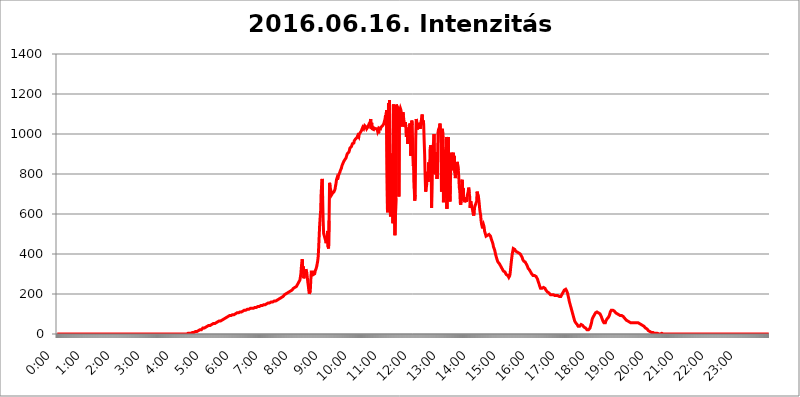
| Category | 2016.06.16. Intenzitás [W/m^2] |
|---|---|
| 0.0 | 0 |
| 0.0006944444444444445 | 0 |
| 0.001388888888888889 | 0 |
| 0.0020833333333333333 | 0 |
| 0.002777777777777778 | 0 |
| 0.003472222222222222 | 0 |
| 0.004166666666666667 | 0 |
| 0.004861111111111111 | 0 |
| 0.005555555555555556 | 0 |
| 0.0062499999999999995 | 0 |
| 0.006944444444444444 | 0 |
| 0.007638888888888889 | 0 |
| 0.008333333333333333 | 0 |
| 0.009027777777777779 | 0 |
| 0.009722222222222222 | 0 |
| 0.010416666666666666 | 0 |
| 0.011111111111111112 | 0 |
| 0.011805555555555555 | 0 |
| 0.012499999999999999 | 0 |
| 0.013194444444444444 | 0 |
| 0.013888888888888888 | 0 |
| 0.014583333333333332 | 0 |
| 0.015277777777777777 | 0 |
| 0.015972222222222224 | 0 |
| 0.016666666666666666 | 0 |
| 0.017361111111111112 | 0 |
| 0.018055555555555557 | 0 |
| 0.01875 | 0 |
| 0.019444444444444445 | 0 |
| 0.02013888888888889 | 0 |
| 0.020833333333333332 | 0 |
| 0.02152777777777778 | 0 |
| 0.022222222222222223 | 0 |
| 0.02291666666666667 | 0 |
| 0.02361111111111111 | 0 |
| 0.024305555555555556 | 0 |
| 0.024999999999999998 | 0 |
| 0.025694444444444447 | 0 |
| 0.02638888888888889 | 0 |
| 0.027083333333333334 | 0 |
| 0.027777777777777776 | 0 |
| 0.02847222222222222 | 0 |
| 0.029166666666666664 | 0 |
| 0.029861111111111113 | 0 |
| 0.030555555555555555 | 0 |
| 0.03125 | 0 |
| 0.03194444444444445 | 0 |
| 0.03263888888888889 | 0 |
| 0.03333333333333333 | 0 |
| 0.034027777777777775 | 0 |
| 0.034722222222222224 | 0 |
| 0.035416666666666666 | 0 |
| 0.036111111111111115 | 0 |
| 0.03680555555555556 | 0 |
| 0.0375 | 0 |
| 0.03819444444444444 | 0 |
| 0.03888888888888889 | 0 |
| 0.03958333333333333 | 0 |
| 0.04027777777777778 | 0 |
| 0.04097222222222222 | 0 |
| 0.041666666666666664 | 0 |
| 0.042361111111111106 | 0 |
| 0.04305555555555556 | 0 |
| 0.043750000000000004 | 0 |
| 0.044444444444444446 | 0 |
| 0.04513888888888889 | 0 |
| 0.04583333333333334 | 0 |
| 0.04652777777777778 | 0 |
| 0.04722222222222222 | 0 |
| 0.04791666666666666 | 0 |
| 0.04861111111111111 | 0 |
| 0.049305555555555554 | 0 |
| 0.049999999999999996 | 0 |
| 0.05069444444444445 | 0 |
| 0.051388888888888894 | 0 |
| 0.052083333333333336 | 0 |
| 0.05277777777777778 | 0 |
| 0.05347222222222222 | 0 |
| 0.05416666666666667 | 0 |
| 0.05486111111111111 | 0 |
| 0.05555555555555555 | 0 |
| 0.05625 | 0 |
| 0.05694444444444444 | 0 |
| 0.057638888888888885 | 0 |
| 0.05833333333333333 | 0 |
| 0.05902777777777778 | 0 |
| 0.059722222222222225 | 0 |
| 0.06041666666666667 | 0 |
| 0.061111111111111116 | 0 |
| 0.06180555555555556 | 0 |
| 0.0625 | 0 |
| 0.06319444444444444 | 0 |
| 0.06388888888888888 | 0 |
| 0.06458333333333334 | 0 |
| 0.06527777777777778 | 0 |
| 0.06597222222222222 | 0 |
| 0.06666666666666667 | 0 |
| 0.06736111111111111 | 0 |
| 0.06805555555555555 | 0 |
| 0.06874999999999999 | 0 |
| 0.06944444444444443 | 0 |
| 0.07013888888888889 | 0 |
| 0.07083333333333333 | 0 |
| 0.07152777777777779 | 0 |
| 0.07222222222222223 | 0 |
| 0.07291666666666667 | 0 |
| 0.07361111111111111 | 0 |
| 0.07430555555555556 | 0 |
| 0.075 | 0 |
| 0.07569444444444444 | 0 |
| 0.0763888888888889 | 0 |
| 0.07708333333333334 | 0 |
| 0.07777777777777778 | 0 |
| 0.07847222222222222 | 0 |
| 0.07916666666666666 | 0 |
| 0.0798611111111111 | 0 |
| 0.08055555555555556 | 0 |
| 0.08125 | 0 |
| 0.08194444444444444 | 0 |
| 0.08263888888888889 | 0 |
| 0.08333333333333333 | 0 |
| 0.08402777777777777 | 0 |
| 0.08472222222222221 | 0 |
| 0.08541666666666665 | 0 |
| 0.08611111111111112 | 0 |
| 0.08680555555555557 | 0 |
| 0.08750000000000001 | 0 |
| 0.08819444444444445 | 0 |
| 0.08888888888888889 | 0 |
| 0.08958333333333333 | 0 |
| 0.09027777777777778 | 0 |
| 0.09097222222222222 | 0 |
| 0.09166666666666667 | 0 |
| 0.09236111111111112 | 0 |
| 0.09305555555555556 | 0 |
| 0.09375 | 0 |
| 0.09444444444444444 | 0 |
| 0.09513888888888888 | 0 |
| 0.09583333333333333 | 0 |
| 0.09652777777777777 | 0 |
| 0.09722222222222222 | 0 |
| 0.09791666666666667 | 0 |
| 0.09861111111111111 | 0 |
| 0.09930555555555555 | 0 |
| 0.09999999999999999 | 0 |
| 0.10069444444444443 | 0 |
| 0.1013888888888889 | 0 |
| 0.10208333333333335 | 0 |
| 0.10277777777777779 | 0 |
| 0.10347222222222223 | 0 |
| 0.10416666666666667 | 0 |
| 0.10486111111111111 | 0 |
| 0.10555555555555556 | 0 |
| 0.10625 | 0 |
| 0.10694444444444444 | 0 |
| 0.1076388888888889 | 0 |
| 0.10833333333333334 | 0 |
| 0.10902777777777778 | 0 |
| 0.10972222222222222 | 0 |
| 0.1111111111111111 | 0 |
| 0.11180555555555556 | 0 |
| 0.11180555555555556 | 0 |
| 0.1125 | 0 |
| 0.11319444444444444 | 0 |
| 0.11388888888888889 | 0 |
| 0.11458333333333333 | 0 |
| 0.11527777777777777 | 0 |
| 0.11597222222222221 | 0 |
| 0.11666666666666665 | 0 |
| 0.1173611111111111 | 0 |
| 0.11805555555555557 | 0 |
| 0.11944444444444445 | 0 |
| 0.12013888888888889 | 0 |
| 0.12083333333333333 | 0 |
| 0.12152777777777778 | 0 |
| 0.12222222222222223 | 0 |
| 0.12291666666666667 | 0 |
| 0.12291666666666667 | 0 |
| 0.12361111111111112 | 0 |
| 0.12430555555555556 | 0 |
| 0.125 | 0 |
| 0.12569444444444444 | 0 |
| 0.12638888888888888 | 0 |
| 0.12708333333333333 | 0 |
| 0.16875 | 0 |
| 0.12847222222222224 | 0 |
| 0.12916666666666668 | 0 |
| 0.12986111111111112 | 0 |
| 0.13055555555555556 | 0 |
| 0.13125 | 0 |
| 0.13194444444444445 | 0 |
| 0.1326388888888889 | 0 |
| 0.13333333333333333 | 0 |
| 0.13402777777777777 | 0 |
| 0.13402777777777777 | 0 |
| 0.13472222222222222 | 0 |
| 0.13541666666666666 | 0 |
| 0.1361111111111111 | 0 |
| 0.13749999999999998 | 0 |
| 0.13819444444444443 | 0 |
| 0.1388888888888889 | 0 |
| 0.13958333333333334 | 0 |
| 0.14027777777777778 | 0 |
| 0.14097222222222222 | 0 |
| 0.14166666666666666 | 0 |
| 0.1423611111111111 | 0 |
| 0.14305555555555557 | 0 |
| 0.14375000000000002 | 0 |
| 0.14444444444444446 | 0 |
| 0.1451388888888889 | 0 |
| 0.1451388888888889 | 0 |
| 0.14652777777777778 | 0 |
| 0.14722222222222223 | 0 |
| 0.14791666666666667 | 0 |
| 0.1486111111111111 | 0 |
| 0.14930555555555555 | 0 |
| 0.15 | 0 |
| 0.15069444444444444 | 0 |
| 0.15138888888888888 | 0 |
| 0.15208333333333332 | 0 |
| 0.15277777777777776 | 0 |
| 0.15347222222222223 | 0 |
| 0.15416666666666667 | 0 |
| 0.15486111111111112 | 0 |
| 0.15555555555555556 | 0 |
| 0.15625 | 0 |
| 0.15694444444444444 | 0 |
| 0.15763888888888888 | 0 |
| 0.15833333333333333 | 0 |
| 0.15902777777777777 | 0 |
| 0.15972222222222224 | 0 |
| 0.16041666666666668 | 0 |
| 0.16111111111111112 | 0 |
| 0.16180555555555556 | 0 |
| 0.1625 | 0 |
| 0.16319444444444445 | 0 |
| 0.1638888888888889 | 0 |
| 0.16458333333333333 | 0 |
| 0.16527777777777777 | 0 |
| 0.16597222222222222 | 0 |
| 0.16666666666666666 | 0 |
| 0.1673611111111111 | 0 |
| 0.16805555555555554 | 0 |
| 0.16874999999999998 | 0 |
| 0.16944444444444443 | 0 |
| 0.17013888888888887 | 0 |
| 0.1708333333333333 | 0 |
| 0.17152777777777775 | 0 |
| 0.17222222222222225 | 0 |
| 0.1729166666666667 | 0 |
| 0.17361111111111113 | 0 |
| 0.17430555555555557 | 0 |
| 0.17500000000000002 | 0 |
| 0.17569444444444446 | 0 |
| 0.1763888888888889 | 0 |
| 0.17708333333333334 | 0 |
| 0.17777777777777778 | 0 |
| 0.17847222222222223 | 0 |
| 0.17916666666666667 | 0 |
| 0.1798611111111111 | 0 |
| 0.18055555555555555 | 0 |
| 0.18125 | 0 |
| 0.18194444444444444 | 0 |
| 0.1826388888888889 | 0 |
| 0.18333333333333335 | 3.525 |
| 0.1840277777777778 | 3.525 |
| 0.18472222222222223 | 3.525 |
| 0.18541666666666667 | 3.525 |
| 0.18611111111111112 | 3.525 |
| 0.18680555555555556 | 3.525 |
| 0.1875 | 3.525 |
| 0.18819444444444444 | 3.525 |
| 0.18888888888888888 | 3.525 |
| 0.18958333333333333 | 7.887 |
| 0.19027777777777777 | 7.887 |
| 0.1909722222222222 | 7.887 |
| 0.19166666666666665 | 7.887 |
| 0.19236111111111112 | 7.887 |
| 0.19305555555555554 | 7.887 |
| 0.19375 | 12.257 |
| 0.19444444444444445 | 12.257 |
| 0.1951388888888889 | 12.257 |
| 0.19583333333333333 | 12.257 |
| 0.19652777777777777 | 12.257 |
| 0.19722222222222222 | 16.636 |
| 0.19791666666666666 | 16.636 |
| 0.1986111111111111 | 16.636 |
| 0.19930555555555554 | 16.636 |
| 0.19999999999999998 | 21.024 |
| 0.20069444444444443 | 21.024 |
| 0.20138888888888887 | 21.024 |
| 0.2020833333333333 | 21.024 |
| 0.2027777777777778 | 25.419 |
| 0.2034722222222222 | 25.419 |
| 0.2041666666666667 | 29.823 |
| 0.20486111111111113 | 29.823 |
| 0.20555555555555557 | 29.823 |
| 0.20625000000000002 | 29.823 |
| 0.20694444444444446 | 29.823 |
| 0.2076388888888889 | 34.234 |
| 0.20833333333333334 | 34.234 |
| 0.20902777777777778 | 38.653 |
| 0.20972222222222223 | 38.653 |
| 0.21041666666666667 | 38.653 |
| 0.2111111111111111 | 38.653 |
| 0.21180555555555555 | 38.653 |
| 0.2125 | 43.079 |
| 0.21319444444444444 | 43.079 |
| 0.2138888888888889 | 43.079 |
| 0.21458333333333335 | 43.079 |
| 0.2152777777777778 | 47.511 |
| 0.21597222222222223 | 47.511 |
| 0.21666666666666667 | 47.511 |
| 0.21736111111111112 | 47.511 |
| 0.21805555555555556 | 47.511 |
| 0.21875 | 51.951 |
| 0.21944444444444444 | 51.951 |
| 0.22013888888888888 | 51.951 |
| 0.22083333333333333 | 51.951 |
| 0.22152777777777777 | 56.398 |
| 0.2222222222222222 | 56.398 |
| 0.22291666666666665 | 56.398 |
| 0.2236111111111111 | 56.398 |
| 0.22430555555555556 | 60.85 |
| 0.225 | 60.85 |
| 0.22569444444444445 | 60.85 |
| 0.2263888888888889 | 60.85 |
| 0.22708333333333333 | 65.31 |
| 0.22777777777777777 | 65.31 |
| 0.22847222222222222 | 65.31 |
| 0.22916666666666666 | 65.31 |
| 0.2298611111111111 | 69.775 |
| 0.23055555555555554 | 69.775 |
| 0.23124999999999998 | 69.775 |
| 0.23194444444444443 | 74.246 |
| 0.23263888888888887 | 74.246 |
| 0.2333333333333333 | 74.246 |
| 0.2340277777777778 | 78.722 |
| 0.2347222222222222 | 78.722 |
| 0.2354166666666667 | 78.722 |
| 0.23611111111111113 | 78.722 |
| 0.23680555555555557 | 83.205 |
| 0.23750000000000002 | 83.205 |
| 0.23819444444444446 | 83.205 |
| 0.2388888888888889 | 83.205 |
| 0.23958333333333334 | 87.692 |
| 0.24027777777777778 | 87.692 |
| 0.24097222222222223 | 87.692 |
| 0.24166666666666667 | 92.184 |
| 0.2423611111111111 | 92.184 |
| 0.24305555555555555 | 92.184 |
| 0.24375 | 92.184 |
| 0.24444444444444446 | 92.184 |
| 0.24513888888888888 | 92.184 |
| 0.24583333333333335 | 96.682 |
| 0.2465277777777778 | 96.682 |
| 0.24722222222222223 | 96.682 |
| 0.24791666666666667 | 96.682 |
| 0.24861111111111112 | 96.682 |
| 0.24930555555555556 | 101.184 |
| 0.25 | 101.184 |
| 0.25069444444444444 | 101.184 |
| 0.2513888888888889 | 101.184 |
| 0.2520833333333333 | 105.69 |
| 0.25277777777777777 | 105.69 |
| 0.2534722222222222 | 105.69 |
| 0.25416666666666665 | 105.69 |
| 0.2548611111111111 | 105.69 |
| 0.2555555555555556 | 110.201 |
| 0.25625000000000003 | 110.201 |
| 0.2569444444444445 | 110.201 |
| 0.2576388888888889 | 110.201 |
| 0.25833333333333336 | 110.201 |
| 0.2590277777777778 | 110.201 |
| 0.25972222222222224 | 114.716 |
| 0.2604166666666667 | 114.716 |
| 0.2611111111111111 | 114.716 |
| 0.26180555555555557 | 114.716 |
| 0.2625 | 119.235 |
| 0.26319444444444445 | 119.235 |
| 0.2638888888888889 | 119.235 |
| 0.26458333333333334 | 119.235 |
| 0.2652777777777778 | 119.235 |
| 0.2659722222222222 | 119.235 |
| 0.26666666666666666 | 123.758 |
| 0.2673611111111111 | 123.758 |
| 0.26805555555555555 | 123.758 |
| 0.26875 | 123.758 |
| 0.26944444444444443 | 123.758 |
| 0.2701388888888889 | 128.284 |
| 0.2708333333333333 | 128.284 |
| 0.27152777777777776 | 128.284 |
| 0.2722222222222222 | 128.284 |
| 0.27291666666666664 | 128.284 |
| 0.2736111111111111 | 128.284 |
| 0.2743055555555555 | 128.284 |
| 0.27499999999999997 | 128.284 |
| 0.27569444444444446 | 132.814 |
| 0.27638888888888885 | 132.814 |
| 0.27708333333333335 | 132.814 |
| 0.2777777777777778 | 132.814 |
| 0.27847222222222223 | 132.814 |
| 0.2791666666666667 | 132.814 |
| 0.2798611111111111 | 137.347 |
| 0.28055555555555556 | 137.347 |
| 0.28125 | 137.347 |
| 0.28194444444444444 | 137.347 |
| 0.2826388888888889 | 137.347 |
| 0.2833333333333333 | 137.347 |
| 0.28402777777777777 | 137.347 |
| 0.2847222222222222 | 141.884 |
| 0.28541666666666665 | 141.884 |
| 0.28611111111111115 | 141.884 |
| 0.28680555555555554 | 141.884 |
| 0.28750000000000003 | 141.884 |
| 0.2881944444444445 | 141.884 |
| 0.2888888888888889 | 146.423 |
| 0.28958333333333336 | 146.423 |
| 0.2902777777777778 | 146.423 |
| 0.29097222222222224 | 146.423 |
| 0.2916666666666667 | 146.423 |
| 0.2923611111111111 | 150.964 |
| 0.29305555555555557 | 150.964 |
| 0.29375 | 150.964 |
| 0.29444444444444445 | 155.509 |
| 0.2951388888888889 | 155.509 |
| 0.29583333333333334 | 155.509 |
| 0.2965277777777778 | 155.509 |
| 0.2972222222222222 | 155.509 |
| 0.29791666666666666 | 155.509 |
| 0.2986111111111111 | 155.509 |
| 0.29930555555555555 | 160.056 |
| 0.3 | 160.056 |
| 0.30069444444444443 | 155.509 |
| 0.3013888888888889 | 155.509 |
| 0.3020833333333333 | 160.056 |
| 0.30277777777777776 | 160.056 |
| 0.3034722222222222 | 160.056 |
| 0.30416666666666664 | 164.605 |
| 0.3048611111111111 | 164.605 |
| 0.3055555555555555 | 164.605 |
| 0.30624999999999997 | 164.605 |
| 0.3069444444444444 | 164.605 |
| 0.3076388888888889 | 164.605 |
| 0.30833333333333335 | 169.156 |
| 0.3090277777777778 | 169.156 |
| 0.30972222222222223 | 173.709 |
| 0.3104166666666667 | 173.709 |
| 0.3111111111111111 | 173.709 |
| 0.31180555555555556 | 173.709 |
| 0.3125 | 178.264 |
| 0.31319444444444444 | 178.264 |
| 0.3138888888888889 | 182.82 |
| 0.3145833333333333 | 182.82 |
| 0.31527777777777777 | 182.82 |
| 0.3159722222222222 | 187.378 |
| 0.31666666666666665 | 187.378 |
| 0.31736111111111115 | 191.937 |
| 0.31805555555555554 | 191.937 |
| 0.31875000000000003 | 196.497 |
| 0.3194444444444445 | 196.497 |
| 0.3201388888888889 | 201.058 |
| 0.32083333333333336 | 201.058 |
| 0.3215277777777778 | 201.058 |
| 0.32222222222222224 | 205.62 |
| 0.3229166666666667 | 205.62 |
| 0.3236111111111111 | 210.182 |
| 0.32430555555555557 | 210.182 |
| 0.325 | 210.182 |
| 0.32569444444444445 | 214.746 |
| 0.3263888888888889 | 214.746 |
| 0.32708333333333334 | 214.746 |
| 0.3277777777777778 | 219.309 |
| 0.3284722222222222 | 219.309 |
| 0.32916666666666666 | 219.309 |
| 0.3298611111111111 | 223.873 |
| 0.33055555555555555 | 223.873 |
| 0.33125 | 228.436 |
| 0.33194444444444443 | 228.436 |
| 0.3326388888888889 | 228.436 |
| 0.3333333333333333 | 233 |
| 0.3340277777777778 | 233 |
| 0.3347222222222222 | 237.564 |
| 0.3354166666666667 | 237.564 |
| 0.3361111111111111 | 242.127 |
| 0.3368055555555556 | 242.127 |
| 0.33749999999999997 | 251.251 |
| 0.33819444444444446 | 251.251 |
| 0.33888888888888885 | 260.373 |
| 0.33958333333333335 | 264.932 |
| 0.34027777777777773 | 269.49 |
| 0.34097222222222223 | 283.156 |
| 0.3416666666666666 | 301.354 |
| 0.3423611111111111 | 333.113 |
| 0.3430555555555555 | 360.221 |
| 0.34375 | 373.729 |
| 0.3444444444444445 | 301.354 |
| 0.3451388888888889 | 337.639 |
| 0.3458333333333334 | 278.603 |
| 0.34652777777777777 | 292.259 |
| 0.34722222222222227 | 292.259 |
| 0.34791666666666665 | 310.44 |
| 0.34861111111111115 | 324.052 |
| 0.34930555555555554 | 324.052 |
| 0.35000000000000003 | 305.898 |
| 0.3506944444444444 | 283.156 |
| 0.3513888888888889 | 260.373 |
| 0.3520833333333333 | 242.127 |
| 0.3527777777777778 | 219.309 |
| 0.3534722222222222 | 201.058 |
| 0.3541666666666667 | 201.058 |
| 0.3548611111111111 | 214.746 |
| 0.35555555555555557 | 264.932 |
| 0.35625 | 310.44 |
| 0.35694444444444445 | 314.98 |
| 0.3576388888888889 | 314.98 |
| 0.35833333333333334 | 310.44 |
| 0.3590277777777778 | 296.808 |
| 0.3597222222222222 | 296.808 |
| 0.36041666666666666 | 301.354 |
| 0.3611111111111111 | 301.354 |
| 0.36180555555555555 | 314.98 |
| 0.3625 | 319.517 |
| 0.36319444444444443 | 328.584 |
| 0.3638888888888889 | 337.639 |
| 0.3645833333333333 | 351.198 |
| 0.3652777777777778 | 364.728 |
| 0.3659722222222222 | 387.202 |
| 0.3666666666666667 | 431.833 |
| 0.3673611111111111 | 489.108 |
| 0.3680555555555556 | 545.416 |
| 0.36874999999999997 | 583.779 |
| 0.36944444444444446 | 617.436 |
| 0.37013888888888885 | 703.762 |
| 0.37083333333333335 | 743.859 |
| 0.37152777777777773 | 775.492 |
| 0.37222222222222223 | 683.473 |
| 0.3729166666666666 | 571.049 |
| 0.3736111111111111 | 502.192 |
| 0.3743055555555555 | 493.475 |
| 0.375 | 489.108 |
| 0.3756944444444445 | 489.108 |
| 0.3763888888888889 | 467.187 |
| 0.3770833333333334 | 453.968 |
| 0.37777777777777777 | 467.187 |
| 0.37847222222222227 | 467.187 |
| 0.37916666666666665 | 515.223 |
| 0.37986111111111115 | 436.27 |
| 0.38055555555555554 | 427.39 |
| 0.38125000000000003 | 566.793 |
| 0.3819444444444444 | 755.766 |
| 0.3826388888888889 | 735.89 |
| 0.3833333333333333 | 723.889 |
| 0.3840277777777778 | 711.832 |
| 0.3847222222222222 | 695.666 |
| 0.3854166666666667 | 699.717 |
| 0.3861111111111111 | 703.762 |
| 0.38680555555555557 | 703.762 |
| 0.3875 | 707.8 |
| 0.38819444444444445 | 711.832 |
| 0.3888888888888889 | 715.858 |
| 0.38958333333333334 | 723.889 |
| 0.3902777777777778 | 739.877 |
| 0.3909722222222222 | 751.803 |
| 0.39166666666666666 | 771.559 |
| 0.3923611111111111 | 779.42 |
| 0.39305555555555555 | 771.559 |
| 0.39375 | 783.342 |
| 0.39444444444444443 | 783.342 |
| 0.3951388888888889 | 798.974 |
| 0.3958333333333333 | 798.974 |
| 0.3965277777777778 | 810.641 |
| 0.3972222222222222 | 818.392 |
| 0.3979166666666667 | 822.26 |
| 0.3986111111111111 | 829.981 |
| 0.3993055555555556 | 841.526 |
| 0.39999999999999997 | 845.365 |
| 0.40069444444444446 | 853.029 |
| 0.40138888888888885 | 856.855 |
| 0.40208333333333335 | 864.493 |
| 0.40277777777777773 | 868.305 |
| 0.40347222222222223 | 872.114 |
| 0.4041666666666666 | 875.918 |
| 0.4048611111111111 | 879.719 |
| 0.4055555555555555 | 887.309 |
| 0.40625 | 894.885 |
| 0.4069444444444445 | 902.447 |
| 0.4076388888888889 | 906.223 |
| 0.4083333333333334 | 902.447 |
| 0.40902777777777777 | 909.996 |
| 0.40972222222222227 | 917.534 |
| 0.41041666666666665 | 928.819 |
| 0.41111111111111115 | 928.819 |
| 0.41180555555555554 | 932.576 |
| 0.41250000000000003 | 936.33 |
| 0.4131944444444444 | 943.832 |
| 0.4138888888888889 | 951.327 |
| 0.4145833333333333 | 955.071 |
| 0.4152777777777778 | 955.071 |
| 0.4159722222222222 | 955.071 |
| 0.4166666666666667 | 966.295 |
| 0.4173611111111111 | 970.034 |
| 0.41805555555555557 | 973.772 |
| 0.41875 | 973.772 |
| 0.41944444444444445 | 977.508 |
| 0.4201388888888889 | 981.244 |
| 0.42083333333333334 | 984.98 |
| 0.4215277777777778 | 992.448 |
| 0.4222222222222222 | 988.714 |
| 0.42291666666666666 | 984.98 |
| 0.4236111111111111 | 999.916 |
| 0.42430555555555555 | 999.916 |
| 0.425 | 1007.383 |
| 0.42569444444444443 | 1011.118 |
| 0.4263888888888889 | 1014.852 |
| 0.4270833333333333 | 1018.587 |
| 0.4277777777777778 | 1011.118 |
| 0.4284722222222222 | 1033.537 |
| 0.4291666666666667 | 1033.537 |
| 0.4298611111111111 | 1026.06 |
| 0.4305555555555556 | 1033.537 |
| 0.43124999999999997 | 1041.019 |
| 0.43194444444444446 | 1037.277 |
| 0.43263888888888885 | 1037.277 |
| 0.43333333333333335 | 1033.537 |
| 0.43402777777777773 | 1026.06 |
| 0.43472222222222223 | 1026.06 |
| 0.4354166666666666 | 1033.537 |
| 0.4361111111111111 | 1037.277 |
| 0.4368055555555555 | 1037.277 |
| 0.4375 | 1052.255 |
| 0.4381944444444445 | 1052.255 |
| 0.4388888888888889 | 1059.756 |
| 0.4395833333333334 | 1074.789 |
| 0.44027777777777777 | 1026.06 |
| 0.44097222222222227 | 1056.004 |
| 0.44166666666666665 | 1026.06 |
| 0.44236111111111115 | 1026.06 |
| 0.44305555555555554 | 1029.798 |
| 0.44375000000000003 | 1022.323 |
| 0.4444444444444444 | 1029.798 |
| 0.4451388888888889 | 1029.798 |
| 0.4458333333333333 | 1029.798 |
| 0.4465277777777778 | 1026.06 |
| 0.4472222222222222 | 1026.06 |
| 0.4479166666666667 | 1026.06 |
| 0.4486111111111111 | 1026.06 |
| 0.44930555555555557 | 1014.852 |
| 0.45 | 1022.323 |
| 0.45069444444444445 | 1003.65 |
| 0.4513888888888889 | 1029.798 |
| 0.45208333333333334 | 1026.06 |
| 0.4527777777777778 | 1026.06 |
| 0.4534722222222222 | 1026.06 |
| 0.45416666666666666 | 1033.537 |
| 0.4548611111111111 | 1029.798 |
| 0.45555555555555555 | 1037.277 |
| 0.45625 | 1041.019 |
| 0.45694444444444443 | 1044.762 |
| 0.4576388888888889 | 1048.508 |
| 0.4583333333333333 | 1056.004 |
| 0.4590277777777778 | 1059.756 |
| 0.4597222222222222 | 1074.789 |
| 0.4604166666666667 | 1093.653 |
| 0.4611111111111111 | 1071.027 |
| 0.4618055555555556 | 1120.238 |
| 0.46249999999999997 | 1124.056 |
| 0.46319444444444446 | 609.062 |
| 0.46388888888888885 | 837.682 |
| 0.46458333333333335 | 1154.814 |
| 0.46527777777777773 | 802.868 |
| 0.46597222222222223 | 1170.358 |
| 0.4666666666666666 | 707.8 |
| 0.4673611111111111 | 588.009 |
| 0.4680555555555555 | 763.674 |
| 0.46875 | 902.447 |
| 0.4694444444444445 | 759.723 |
| 0.4701388888888889 | 629.948 |
| 0.4708333333333334 | 553.986 |
| 0.47152777777777777 | 1147.086 |
| 0.47222222222222227 | 654.791 |
| 0.47291666666666665 | 658.909 |
| 0.47361111111111115 | 493.475 |
| 0.47430555555555554 | 497.836 |
| 0.47500000000000003 | 679.395 |
| 0.4756944444444444 | 1147.086 |
| 0.4763888888888889 | 1139.384 |
| 0.4770833333333333 | 1135.543 |
| 0.4777777777777778 | 1131.708 |
| 0.4784722222222222 | 1120.238 |
| 0.4791666666666667 | 687.544 |
| 0.4798611111111111 | 1108.816 |
| 0.48055555555555557 | 1105.019 |
| 0.48125 | 1127.879 |
| 0.48194444444444445 | 1120.238 |
| 0.4826388888888889 | 1105.019 |
| 0.48333333333333334 | 1074.789 |
| 0.4840277777777778 | 1037.277 |
| 0.4847222222222222 | 1108.816 |
| 0.48541666666666666 | 1093.653 |
| 0.4861111111111111 | 1071.027 |
| 0.48680555555555555 | 1071.027 |
| 0.4875 | 1037.277 |
| 0.48819444444444443 | 1059.756 |
| 0.4888888888888889 | 1037.277 |
| 0.4895833333333333 | 984.98 |
| 0.4902777777777778 | 988.714 |
| 0.4909722222222222 | 1003.65 |
| 0.4916666666666667 | 951.327 |
| 0.4923611111111111 | 1014.852 |
| 0.4930555555555556 | 1033.537 |
| 0.49374999999999997 | 1014.852 |
| 0.49444444444444446 | 1052.255 |
| 0.49513888888888885 | 1044.762 |
| 0.49583333333333335 | 891.099 |
| 0.49652777777777773 | 1014.852 |
| 0.49722222222222223 | 1067.267 |
| 0.4979166666666666 | 1044.762 |
| 0.4986111111111111 | 906.223 |
| 0.4993055555555555 | 841.526 |
| 0.5 | 853.029 |
| 0.5006944444444444 | 727.896 |
| 0.5013888888888889 | 667.123 |
| 0.5020833333333333 | 695.666 |
| 0.5027777777777778 | 973.772 |
| 0.5034722222222222 | 1074.789 |
| 0.5041666666666667 | 1063.51 |
| 0.5048611111111111 | 1022.323 |
| 0.5055555555555555 | 1037.277 |
| 0.50625 | 1056.004 |
| 0.5069444444444444 | 1037.277 |
| 0.5076388888888889 | 1052.255 |
| 0.5083333333333333 | 1033.537 |
| 0.5090277777777777 | 1026.06 |
| 0.5097222222222222 | 1022.323 |
| 0.5104166666666666 | 1022.323 |
| 0.5111111111111112 | 1078.555 |
| 0.5118055555555555 | 1097.437 |
| 0.5125000000000001 | 1048.508 |
| 0.5131944444444444 | 1067.267 |
| 0.513888888888889 | 1052.255 |
| 0.5145833333333333 | 970.034 |
| 0.5152777777777778 | 898.668 |
| 0.5159722222222222 | 791.169 |
| 0.5166666666666667 | 711.832 |
| 0.517361111111111 | 723.889 |
| 0.5180555555555556 | 743.859 |
| 0.5187499999999999 | 810.641 |
| 0.5194444444444445 | 791.169 |
| 0.5201388888888888 | 759.723 |
| 0.5208333333333334 | 856.855 |
| 0.5215277777777778 | 783.342 |
| 0.5222222222222223 | 802.868 |
| 0.5229166666666667 | 921.298 |
| 0.5236111111111111 | 943.832 |
| 0.5243055555555556 | 925.06 |
| 0.525 | 629.948 |
| 0.5256944444444445 | 798.974 |
| 0.5263888888888889 | 902.447 |
| 0.5270833333333333 | 932.576 |
| 0.5277777777777778 | 958.814 |
| 0.5284722222222222 | 999.916 |
| 0.5291666666666667 | 798.974 |
| 0.5298611111111111 | 806.757 |
| 0.5305555555555556 | 845.365 |
| 0.53125 | 872.114 |
| 0.5319444444444444 | 909.996 |
| 0.5326388888888889 | 775.492 |
| 0.5333333333333333 | 814.519 |
| 0.5340277777777778 | 1007.383 |
| 0.5347222222222222 | 1022.323 |
| 0.5354166666666667 | 1026.06 |
| 0.5361111111111111 | 1033.537 |
| 0.5368055555555555 | 1052.255 |
| 0.5375 | 1011.118 |
| 0.5381944444444444 | 951.327 |
| 0.5388888888888889 | 711.832 |
| 0.5395833333333333 | 1014.852 |
| 0.5402777777777777 | 1026.06 |
| 0.5409722222222222 | 981.244 |
| 0.5416666666666666 | 658.909 |
| 0.5423611111111112 | 822.26 |
| 0.5430555555555555 | 691.608 |
| 0.5437500000000001 | 679.395 |
| 0.5444444444444444 | 921.298 |
| 0.545138888888889 | 902.447 |
| 0.5458333333333333 | 984.98 |
| 0.5465277777777778 | 625.784 |
| 0.5472222222222222 | 940.082 |
| 0.5479166666666667 | 970.034 |
| 0.548611111111111 | 984.98 |
| 0.5493055555555556 | 679.395 |
| 0.5499999999999999 | 711.832 |
| 0.5506944444444445 | 663.019 |
| 0.5513888888888888 | 739.877 |
| 0.5520833333333334 | 906.223 |
| 0.5527777777777778 | 909.996 |
| 0.5534722222222223 | 872.114 |
| 0.5541666666666667 | 829.981 |
| 0.5548611111111111 | 818.392 |
| 0.5555555555555556 | 906.223 |
| 0.55625 | 875.918 |
| 0.5569444444444445 | 891.099 |
| 0.5576388888888889 | 806.757 |
| 0.5583333333333333 | 779.42 |
| 0.5590277777777778 | 818.392 |
| 0.5597222222222222 | 798.974 |
| 0.5604166666666667 | 822.26 |
| 0.5611111111111111 | 860.676 |
| 0.5618055555555556 | 864.493 |
| 0.5625 | 818.392 |
| 0.5631944444444444 | 783.342 |
| 0.5638888888888889 | 731.896 |
| 0.5645833333333333 | 715.858 |
| 0.5652777777777778 | 654.791 |
| 0.5659722222222222 | 646.537 |
| 0.5666666666666667 | 691.608 |
| 0.5673611111111111 | 763.674 |
| 0.5680555555555555 | 771.559 |
| 0.56875 | 715.858 |
| 0.5694444444444444 | 727.896 |
| 0.5701388888888889 | 667.123 |
| 0.5708333333333333 | 683.473 |
| 0.5715277777777777 | 658.909 |
| 0.5722222222222222 | 667.123 |
| 0.5729166666666666 | 671.22 |
| 0.5736111111111112 | 663.019 |
| 0.5743055555555555 | 667.123 |
| 0.5750000000000001 | 691.608 |
| 0.5756944444444444 | 691.608 |
| 0.576388888888889 | 711.832 |
| 0.5770833333333333 | 731.896 |
| 0.5777777777777778 | 703.762 |
| 0.5784722222222222 | 687.544 |
| 0.5791666666666667 | 629.948 |
| 0.579861111111111 | 663.019 |
| 0.5805555555555556 | 650.667 |
| 0.5812499999999999 | 642.4 |
| 0.5819444444444445 | 642.4 |
| 0.5826388888888888 | 617.436 |
| 0.5833333333333334 | 600.661 |
| 0.5840277777777778 | 592.233 |
| 0.5847222222222223 | 609.062 |
| 0.5854166666666667 | 634.105 |
| 0.5861111111111111 | 642.4 |
| 0.5868055555555556 | 642.4 |
| 0.5875 | 642.4 |
| 0.5881944444444445 | 663.019 |
| 0.5888888888888889 | 711.832 |
| 0.5895833333333333 | 707.8 |
| 0.5902777777777778 | 715.858 |
| 0.5909722222222222 | 679.395 |
| 0.5916666666666667 | 658.909 |
| 0.5923611111111111 | 629.948 |
| 0.5930555555555556 | 609.062 |
| 0.59375 | 596.45 |
| 0.5944444444444444 | 566.793 |
| 0.5951388888888889 | 549.704 |
| 0.5958333333333333 | 545.416 |
| 0.5965277777777778 | 528.2 |
| 0.5972222222222222 | 536.82 |
| 0.5979166666666667 | 545.416 |
| 0.5986111111111111 | 536.82 |
| 0.5993055555555555 | 515.223 |
| 0.6 | 515.223 |
| 0.6006944444444444 | 519.555 |
| 0.6013888888888889 | 489.108 |
| 0.6020833333333333 | 489.108 |
| 0.6027777777777777 | 489.108 |
| 0.6034722222222222 | 493.475 |
| 0.6041666666666666 | 489.108 |
| 0.6048611111111112 | 489.108 |
| 0.6055555555555555 | 497.836 |
| 0.6062500000000001 | 502.192 |
| 0.6069444444444444 | 497.836 |
| 0.607638888888889 | 489.108 |
| 0.6083333333333333 | 480.356 |
| 0.6090277777777778 | 471.582 |
| 0.6097222222222222 | 471.582 |
| 0.6104166666666667 | 458.38 |
| 0.611111111111111 | 449.551 |
| 0.6118055555555556 | 436.27 |
| 0.6124999999999999 | 431.833 |
| 0.6131944444444445 | 422.943 |
| 0.6138888888888888 | 414.035 |
| 0.6145833333333334 | 400.638 |
| 0.6152777777777778 | 391.685 |
| 0.6159722222222223 | 382.715 |
| 0.6166666666666667 | 373.729 |
| 0.6173611111111111 | 369.23 |
| 0.6180555555555556 | 360.221 |
| 0.61875 | 360.221 |
| 0.6194444444444445 | 355.712 |
| 0.6201388888888889 | 351.198 |
| 0.6208333333333333 | 346.682 |
| 0.6215277777777778 | 342.162 |
| 0.6222222222222222 | 337.639 |
| 0.6229166666666667 | 333.113 |
| 0.6236111111111111 | 328.584 |
| 0.6243055555555556 | 324.052 |
| 0.625 | 319.517 |
| 0.6256944444444444 | 314.98 |
| 0.6263888888888889 | 314.98 |
| 0.6270833333333333 | 314.98 |
| 0.6277777777777778 | 310.44 |
| 0.6284722222222222 | 305.898 |
| 0.6291666666666667 | 305.898 |
| 0.6298611111111111 | 296.808 |
| 0.6305555555555555 | 296.808 |
| 0.63125 | 292.259 |
| 0.6319444444444444 | 292.259 |
| 0.6326388888888889 | 287.709 |
| 0.6333333333333333 | 283.156 |
| 0.6340277777777777 | 287.709 |
| 0.6347222222222222 | 292.259 |
| 0.6354166666666666 | 310.44 |
| 0.6361111111111112 | 337.639 |
| 0.6368055555555555 | 360.221 |
| 0.6375000000000001 | 382.715 |
| 0.6381944444444444 | 400.638 |
| 0.638888888888889 | 414.035 |
| 0.6395833333333333 | 427.39 |
| 0.6402777777777778 | 427.39 |
| 0.6409722222222222 | 427.39 |
| 0.6416666666666667 | 422.943 |
| 0.642361111111111 | 418.492 |
| 0.6430555555555556 | 414.035 |
| 0.6437499999999999 | 409.574 |
| 0.6444444444444445 | 409.574 |
| 0.6451388888888888 | 409.574 |
| 0.6458333333333334 | 409.574 |
| 0.6465277777777778 | 409.574 |
| 0.6472222222222223 | 405.108 |
| 0.6479166666666667 | 405.108 |
| 0.6486111111111111 | 405.108 |
| 0.6493055555555556 | 400.638 |
| 0.65 | 396.164 |
| 0.6506944444444445 | 391.685 |
| 0.6513888888888889 | 387.202 |
| 0.6520833333333333 | 382.715 |
| 0.6527777777777778 | 373.729 |
| 0.6534722222222222 | 369.23 |
| 0.6541666666666667 | 364.728 |
| 0.6548611111111111 | 364.728 |
| 0.6555555555555556 | 364.728 |
| 0.65625 | 360.221 |
| 0.6569444444444444 | 355.712 |
| 0.6576388888888889 | 351.198 |
| 0.6583333333333333 | 346.682 |
| 0.6590277777777778 | 342.162 |
| 0.6597222222222222 | 337.639 |
| 0.6604166666666667 | 328.584 |
| 0.6611111111111111 | 324.052 |
| 0.6618055555555555 | 324.052 |
| 0.6625 | 319.517 |
| 0.6631944444444444 | 314.98 |
| 0.6638888888888889 | 310.44 |
| 0.6645833333333333 | 305.898 |
| 0.6652777777777777 | 301.354 |
| 0.6659722222222222 | 301.354 |
| 0.6666666666666666 | 296.808 |
| 0.6673611111111111 | 292.259 |
| 0.6680555555555556 | 292.259 |
| 0.6687500000000001 | 292.259 |
| 0.6694444444444444 | 292.259 |
| 0.6701388888888888 | 292.259 |
| 0.6708333333333334 | 292.259 |
| 0.6715277777777778 | 287.709 |
| 0.6722222222222222 | 283.156 |
| 0.6729166666666666 | 283.156 |
| 0.6736111111111112 | 274.047 |
| 0.6743055555555556 | 264.932 |
| 0.6749999999999999 | 260.373 |
| 0.6756944444444444 | 251.251 |
| 0.6763888888888889 | 242.127 |
| 0.6770833333333334 | 237.564 |
| 0.6777777777777777 | 228.436 |
| 0.6784722222222223 | 228.436 |
| 0.6791666666666667 | 228.436 |
| 0.6798611111111111 | 228.436 |
| 0.6805555555555555 | 223.873 |
| 0.68125 | 233 |
| 0.6819444444444445 | 233 |
| 0.6826388888888889 | 233 |
| 0.6833333333333332 | 233 |
| 0.6840277777777778 | 228.436 |
| 0.6847222222222222 | 223.873 |
| 0.6854166666666667 | 219.309 |
| 0.686111111111111 | 219.309 |
| 0.6868055555555556 | 219.309 |
| 0.6875 | 210.182 |
| 0.6881944444444444 | 210.182 |
| 0.688888888888889 | 205.62 |
| 0.6895833333333333 | 205.62 |
| 0.6902777777777778 | 201.058 |
| 0.6909722222222222 | 201.058 |
| 0.6916666666666668 | 196.497 |
| 0.6923611111111111 | 196.497 |
| 0.6930555555555555 | 196.497 |
| 0.69375 | 196.497 |
| 0.6944444444444445 | 191.937 |
| 0.6951388888888889 | 196.497 |
| 0.6958333333333333 | 196.497 |
| 0.6965277777777777 | 196.497 |
| 0.6972222222222223 | 196.497 |
| 0.6979166666666666 | 191.937 |
| 0.6986111111111111 | 191.937 |
| 0.6993055555555556 | 191.937 |
| 0.7000000000000001 | 191.937 |
| 0.7006944444444444 | 191.937 |
| 0.7013888888888888 | 191.937 |
| 0.7020833333333334 | 191.937 |
| 0.7027777777777778 | 187.378 |
| 0.7034722222222222 | 187.378 |
| 0.7041666666666666 | 187.378 |
| 0.7048611111111112 | 187.378 |
| 0.7055555555555556 | 187.378 |
| 0.7062499999999999 | 187.378 |
| 0.7069444444444444 | 191.937 |
| 0.7076388888888889 | 191.937 |
| 0.7083333333333334 | 201.058 |
| 0.7090277777777777 | 201.058 |
| 0.7097222222222223 | 210.182 |
| 0.7104166666666667 | 214.746 |
| 0.7111111111111111 | 219.309 |
| 0.7118055555555555 | 219.309 |
| 0.7125 | 223.873 |
| 0.7131944444444445 | 223.873 |
| 0.7138888888888889 | 219.309 |
| 0.7145833333333332 | 214.746 |
| 0.7152777777777778 | 210.182 |
| 0.7159722222222222 | 201.058 |
| 0.7166666666666667 | 187.378 |
| 0.717361111111111 | 178.264 |
| 0.7180555555555556 | 164.605 |
| 0.71875 | 155.509 |
| 0.7194444444444444 | 146.423 |
| 0.720138888888889 | 137.347 |
| 0.7208333333333333 | 128.284 |
| 0.7215277777777778 | 119.235 |
| 0.7222222222222222 | 110.201 |
| 0.7229166666666668 | 101.184 |
| 0.7236111111111111 | 92.184 |
| 0.7243055555555555 | 83.205 |
| 0.725 | 74.246 |
| 0.7256944444444445 | 65.31 |
| 0.7263888888888889 | 60.85 |
| 0.7270833333333333 | 56.398 |
| 0.7277777777777777 | 56.398 |
| 0.7284722222222223 | 51.951 |
| 0.7291666666666666 | 47.511 |
| 0.7298611111111111 | 43.079 |
| 0.7305555555555556 | 38.653 |
| 0.7312500000000001 | 38.653 |
| 0.7319444444444444 | 38.653 |
| 0.7326388888888888 | 38.653 |
| 0.7333333333333334 | 43.079 |
| 0.7340277777777778 | 43.079 |
| 0.7347222222222222 | 47.511 |
| 0.7354166666666666 | 47.511 |
| 0.7361111111111112 | 47.511 |
| 0.7368055555555556 | 43.079 |
| 0.7374999999999999 | 38.653 |
| 0.7381944444444444 | 38.653 |
| 0.7388888888888889 | 34.234 |
| 0.7395833333333334 | 29.823 |
| 0.7402777777777777 | 29.823 |
| 0.7409722222222223 | 29.823 |
| 0.7416666666666667 | 25.419 |
| 0.7423611111111111 | 25.419 |
| 0.7430555555555555 | 21.024 |
| 0.74375 | 21.024 |
| 0.7444444444444445 | 21.024 |
| 0.7451388888888889 | 21.024 |
| 0.7458333333333332 | 21.024 |
| 0.7465277777777778 | 25.419 |
| 0.7472222222222222 | 29.823 |
| 0.7479166666666667 | 38.653 |
| 0.748611111111111 | 47.511 |
| 0.7493055555555556 | 56.398 |
| 0.75 | 69.775 |
| 0.7506944444444444 | 78.722 |
| 0.751388888888889 | 83.205 |
| 0.7520833333333333 | 87.692 |
| 0.7527777777777778 | 92.184 |
| 0.7534722222222222 | 96.682 |
| 0.7541666666666668 | 101.184 |
| 0.7548611111111111 | 105.69 |
| 0.7555555555555555 | 105.69 |
| 0.75625 | 105.69 |
| 0.7569444444444445 | 110.201 |
| 0.7576388888888889 | 110.201 |
| 0.7583333333333333 | 110.201 |
| 0.7590277777777777 | 105.69 |
| 0.7597222222222223 | 105.69 |
| 0.7604166666666666 | 101.184 |
| 0.7611111111111111 | 101.184 |
| 0.7618055555555556 | 101.184 |
| 0.7625000000000001 | 92.184 |
| 0.7631944444444444 | 87.692 |
| 0.7638888888888888 | 78.722 |
| 0.7645833333333334 | 74.246 |
| 0.7652777777777778 | 65.31 |
| 0.7659722222222222 | 60.85 |
| 0.7666666666666666 | 56.398 |
| 0.7673611111111112 | 56.398 |
| 0.7680555555555556 | 56.398 |
| 0.7687499999999999 | 56.398 |
| 0.7694444444444444 | 65.31 |
| 0.7701388888888889 | 69.775 |
| 0.7708333333333334 | 74.246 |
| 0.7715277777777777 | 74.246 |
| 0.7722222222222223 | 78.722 |
| 0.7729166666666667 | 83.205 |
| 0.7736111111111111 | 87.692 |
| 0.7743055555555555 | 92.184 |
| 0.775 | 101.184 |
| 0.7756944444444445 | 110.201 |
| 0.7763888888888889 | 114.716 |
| 0.7770833333333332 | 119.235 |
| 0.7777777777777778 | 123.758 |
| 0.7784722222222222 | 123.758 |
| 0.7791666666666667 | 119.235 |
| 0.779861111111111 | 119.235 |
| 0.7805555555555556 | 114.716 |
| 0.78125 | 114.716 |
| 0.7819444444444444 | 110.201 |
| 0.782638888888889 | 110.201 |
| 0.7833333333333333 | 105.69 |
| 0.7840277777777778 | 105.69 |
| 0.7847222222222222 | 101.184 |
| 0.7854166666666668 | 101.184 |
| 0.7861111111111111 | 101.184 |
| 0.7868055555555555 | 96.682 |
| 0.7875 | 96.682 |
| 0.7881944444444445 | 96.682 |
| 0.7888888888888889 | 92.184 |
| 0.7895833333333333 | 92.184 |
| 0.7902777777777777 | 92.184 |
| 0.7909722222222223 | 92.184 |
| 0.7916666666666666 | 92.184 |
| 0.7923611111111111 | 92.184 |
| 0.7930555555555556 | 92.184 |
| 0.7937500000000001 | 87.692 |
| 0.7944444444444444 | 83.205 |
| 0.7951388888888888 | 83.205 |
| 0.7958333333333334 | 78.722 |
| 0.7965277777777778 | 78.722 |
| 0.7972222222222222 | 74.246 |
| 0.7979166666666666 | 69.775 |
| 0.7986111111111112 | 69.775 |
| 0.7993055555555556 | 65.31 |
| 0.7999999999999999 | 65.31 |
| 0.8006944444444444 | 65.31 |
| 0.8013888888888889 | 60.85 |
| 0.8020833333333334 | 60.85 |
| 0.8027777777777777 | 60.85 |
| 0.8034722222222223 | 56.398 |
| 0.8041666666666667 | 56.398 |
| 0.8048611111111111 | 56.398 |
| 0.8055555555555555 | 56.398 |
| 0.80625 | 56.398 |
| 0.8069444444444445 | 56.398 |
| 0.8076388888888889 | 56.398 |
| 0.8083333333333332 | 56.398 |
| 0.8090277777777778 | 56.398 |
| 0.8097222222222222 | 56.398 |
| 0.8104166666666667 | 56.398 |
| 0.811111111111111 | 56.398 |
| 0.8118055555555556 | 56.398 |
| 0.8125 | 56.398 |
| 0.8131944444444444 | 56.398 |
| 0.813888888888889 | 56.398 |
| 0.8145833333333333 | 56.398 |
| 0.8152777777777778 | 51.951 |
| 0.8159722222222222 | 51.951 |
| 0.8166666666666668 | 51.951 |
| 0.8173611111111111 | 51.951 |
| 0.8180555555555555 | 51.951 |
| 0.81875 | 47.511 |
| 0.8194444444444445 | 47.511 |
| 0.8201388888888889 | 47.511 |
| 0.8208333333333333 | 43.079 |
| 0.8215277777777777 | 43.079 |
| 0.8222222222222223 | 38.653 |
| 0.8229166666666666 | 38.653 |
| 0.8236111111111111 | 38.653 |
| 0.8243055555555556 | 34.234 |
| 0.8250000000000001 | 29.823 |
| 0.8256944444444444 | 29.823 |
| 0.8263888888888888 | 25.419 |
| 0.8270833333333334 | 25.419 |
| 0.8277777777777778 | 21.024 |
| 0.8284722222222222 | 21.024 |
| 0.8291666666666666 | 16.636 |
| 0.8298611111111112 | 16.636 |
| 0.8305555555555556 | 12.257 |
| 0.8312499999999999 | 12.257 |
| 0.8319444444444444 | 12.257 |
| 0.8326388888888889 | 12.257 |
| 0.8333333333333334 | 7.887 |
| 0.8340277777777777 | 7.887 |
| 0.8347222222222223 | 7.887 |
| 0.8354166666666667 | 7.887 |
| 0.8361111111111111 | 3.525 |
| 0.8368055555555555 | 3.525 |
| 0.8375 | 3.525 |
| 0.8381944444444445 | 3.525 |
| 0.8388888888888889 | 3.525 |
| 0.8395833333333332 | 3.525 |
| 0.8402777777777778 | 3.525 |
| 0.8409722222222222 | 3.525 |
| 0.8416666666666667 | 3.525 |
| 0.842361111111111 | 3.525 |
| 0.8430555555555556 | 3.525 |
| 0.84375 | 0 |
| 0.8444444444444444 | 0 |
| 0.845138888888889 | 0 |
| 0.8458333333333333 | 0 |
| 0.8465277777777778 | 0 |
| 0.8472222222222222 | 0 |
| 0.8479166666666668 | 3.525 |
| 0.8486111111111111 | 0 |
| 0.8493055555555555 | 0 |
| 0.85 | 0 |
| 0.8506944444444445 | 0 |
| 0.8513888888888889 | 0 |
| 0.8520833333333333 | 0 |
| 0.8527777777777777 | 0 |
| 0.8534722222222223 | 0 |
| 0.8541666666666666 | 0 |
| 0.8548611111111111 | 0 |
| 0.8555555555555556 | 0 |
| 0.8562500000000001 | 0 |
| 0.8569444444444444 | 0 |
| 0.8576388888888888 | 0 |
| 0.8583333333333334 | 0 |
| 0.8590277777777778 | 0 |
| 0.8597222222222222 | 0 |
| 0.8604166666666666 | 0 |
| 0.8611111111111112 | 0 |
| 0.8618055555555556 | 0 |
| 0.8624999999999999 | 0 |
| 0.8631944444444444 | 0 |
| 0.8638888888888889 | 0 |
| 0.8645833333333334 | 0 |
| 0.8652777777777777 | 0 |
| 0.8659722222222223 | 0 |
| 0.8666666666666667 | 0 |
| 0.8673611111111111 | 0 |
| 0.8680555555555555 | 0 |
| 0.86875 | 0 |
| 0.8694444444444445 | 0 |
| 0.8701388888888889 | 0 |
| 0.8708333333333332 | 0 |
| 0.8715277777777778 | 0 |
| 0.8722222222222222 | 0 |
| 0.8729166666666667 | 0 |
| 0.873611111111111 | 0 |
| 0.8743055555555556 | 0 |
| 0.875 | 0 |
| 0.8756944444444444 | 0 |
| 0.876388888888889 | 0 |
| 0.8770833333333333 | 0 |
| 0.8777777777777778 | 0 |
| 0.8784722222222222 | 0 |
| 0.8791666666666668 | 0 |
| 0.8798611111111111 | 0 |
| 0.8805555555555555 | 0 |
| 0.88125 | 0 |
| 0.8819444444444445 | 0 |
| 0.8826388888888889 | 0 |
| 0.8833333333333333 | 0 |
| 0.8840277777777777 | 0 |
| 0.8847222222222223 | 0 |
| 0.8854166666666666 | 0 |
| 0.8861111111111111 | 0 |
| 0.8868055555555556 | 0 |
| 0.8875000000000001 | 0 |
| 0.8881944444444444 | 0 |
| 0.8888888888888888 | 0 |
| 0.8895833333333334 | 0 |
| 0.8902777777777778 | 0 |
| 0.8909722222222222 | 0 |
| 0.8916666666666666 | 0 |
| 0.8923611111111112 | 0 |
| 0.8930555555555556 | 0 |
| 0.8937499999999999 | 0 |
| 0.8944444444444444 | 0 |
| 0.8951388888888889 | 0 |
| 0.8958333333333334 | 0 |
| 0.8965277777777777 | 0 |
| 0.8972222222222223 | 0 |
| 0.8979166666666667 | 0 |
| 0.8986111111111111 | 0 |
| 0.8993055555555555 | 0 |
| 0.9 | 0 |
| 0.9006944444444445 | 0 |
| 0.9013888888888889 | 0 |
| 0.9020833333333332 | 0 |
| 0.9027777777777778 | 0 |
| 0.9034722222222222 | 0 |
| 0.9041666666666667 | 0 |
| 0.904861111111111 | 0 |
| 0.9055555555555556 | 0 |
| 0.90625 | 0 |
| 0.9069444444444444 | 0 |
| 0.907638888888889 | 0 |
| 0.9083333333333333 | 0 |
| 0.9090277777777778 | 0 |
| 0.9097222222222222 | 0 |
| 0.9104166666666668 | 0 |
| 0.9111111111111111 | 0 |
| 0.9118055555555555 | 0 |
| 0.9125 | 0 |
| 0.9131944444444445 | 0 |
| 0.9138888888888889 | 0 |
| 0.9145833333333333 | 0 |
| 0.9152777777777777 | 0 |
| 0.9159722222222223 | 0 |
| 0.9166666666666666 | 0 |
| 0.9173611111111111 | 0 |
| 0.9180555555555556 | 0 |
| 0.9187500000000001 | 0 |
| 0.9194444444444444 | 0 |
| 0.9201388888888888 | 0 |
| 0.9208333333333334 | 0 |
| 0.9215277777777778 | 0 |
| 0.9222222222222222 | 0 |
| 0.9229166666666666 | 0 |
| 0.9236111111111112 | 0 |
| 0.9243055555555556 | 0 |
| 0.9249999999999999 | 0 |
| 0.9256944444444444 | 0 |
| 0.9263888888888889 | 0 |
| 0.9270833333333334 | 0 |
| 0.9277777777777777 | 0 |
| 0.9284722222222223 | 0 |
| 0.9291666666666667 | 0 |
| 0.9298611111111111 | 0 |
| 0.9305555555555555 | 0 |
| 0.93125 | 0 |
| 0.9319444444444445 | 0 |
| 0.9326388888888889 | 0 |
| 0.9333333333333332 | 0 |
| 0.9340277777777778 | 0 |
| 0.9347222222222222 | 0 |
| 0.9354166666666667 | 0 |
| 0.936111111111111 | 0 |
| 0.9368055555555556 | 0 |
| 0.9375 | 0 |
| 0.9381944444444444 | 0 |
| 0.938888888888889 | 0 |
| 0.9395833333333333 | 0 |
| 0.9402777777777778 | 0 |
| 0.9409722222222222 | 0 |
| 0.9416666666666668 | 0 |
| 0.9423611111111111 | 0 |
| 0.9430555555555555 | 0 |
| 0.94375 | 0 |
| 0.9444444444444445 | 0 |
| 0.9451388888888889 | 0 |
| 0.9458333333333333 | 0 |
| 0.9465277777777777 | 0 |
| 0.9472222222222223 | 0 |
| 0.9479166666666666 | 0 |
| 0.9486111111111111 | 0 |
| 0.9493055555555556 | 0 |
| 0.9500000000000001 | 0 |
| 0.9506944444444444 | 0 |
| 0.9513888888888888 | 0 |
| 0.9520833333333334 | 0 |
| 0.9527777777777778 | 0 |
| 0.9534722222222222 | 0 |
| 0.9541666666666666 | 0 |
| 0.9548611111111112 | 0 |
| 0.9555555555555556 | 0 |
| 0.9562499999999999 | 0 |
| 0.9569444444444444 | 0 |
| 0.9576388888888889 | 0 |
| 0.9583333333333334 | 0 |
| 0.9590277777777777 | 0 |
| 0.9597222222222223 | 0 |
| 0.9604166666666667 | 0 |
| 0.9611111111111111 | 0 |
| 0.9618055555555555 | 0 |
| 0.9625 | 0 |
| 0.9631944444444445 | 0 |
| 0.9638888888888889 | 0 |
| 0.9645833333333332 | 0 |
| 0.9652777777777778 | 0 |
| 0.9659722222222222 | 0 |
| 0.9666666666666667 | 0 |
| 0.967361111111111 | 0 |
| 0.9680555555555556 | 0 |
| 0.96875 | 0 |
| 0.9694444444444444 | 0 |
| 0.970138888888889 | 0 |
| 0.9708333333333333 | 0 |
| 0.9715277777777778 | 0 |
| 0.9722222222222222 | 0 |
| 0.9729166666666668 | 0 |
| 0.9736111111111111 | 0 |
| 0.9743055555555555 | 0 |
| 0.975 | 0 |
| 0.9756944444444445 | 0 |
| 0.9763888888888889 | 0 |
| 0.9770833333333333 | 0 |
| 0.9777777777777777 | 0 |
| 0.9784722222222223 | 0 |
| 0.9791666666666666 | 0 |
| 0.9798611111111111 | 0 |
| 0.9805555555555556 | 0 |
| 0.9812500000000001 | 0 |
| 0.9819444444444444 | 0 |
| 0.9826388888888888 | 0 |
| 0.9833333333333334 | 0 |
| 0.9840277777777778 | 0 |
| 0.9847222222222222 | 0 |
| 0.9854166666666666 | 0 |
| 0.9861111111111112 | 0 |
| 0.9868055555555556 | 0 |
| 0.9874999999999999 | 0 |
| 0.9881944444444444 | 0 |
| 0.9888888888888889 | 0 |
| 0.9895833333333334 | 0 |
| 0.9902777777777777 | 0 |
| 0.9909722222222223 | 0 |
| 0.9916666666666667 | 0 |
| 0.9923611111111111 | 0 |
| 0.9930555555555555 | 0 |
| 0.99375 | 0 |
| 0.9944444444444445 | 0 |
| 0.9951388888888889 | 0 |
| 0.9958333333333332 | 0 |
| 0.9965277777777778 | 0 |
| 0.9972222222222222 | 0 |
| 0.9979166666666667 | 0 |
| 0.998611111111111 | 0 |
| 0.9993055555555556 | 0 |